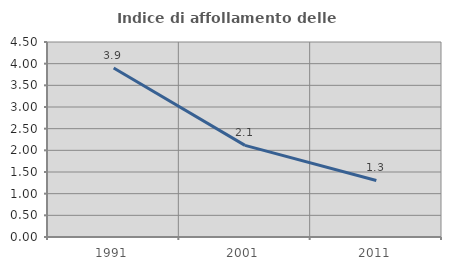
| Category | Indice di affollamento delle abitazioni  |
|---|---|
| 1991.0 | 3.9 |
| 2001.0 | 2.115 |
| 2011.0 | 1.305 |